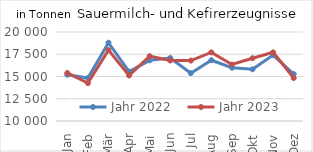
| Category | Jahr 2022 | Jahr 2023 |
|---|---|---|
| Jan | 15200.041 | 15396.886 |
| Feb | 14832.887 | 14256.301 |
| Mär | 18800.027 | 17967.528 |
| Apr | 15550.116 | 15110.787 |
| Mai | 16811.276 | 17283.223 |
| Jun | 17081.681 | 16797.275 |
| Jul | 15375.857 | 16786.662 |
| Aug | 16826.864 | 17707.107 |
| Sep | 15983.62 | 16351.674 |
| Okt | 15808.461 | 17053.779 |
| Nov | 17408.835 | 17716.265 |
| Dez | 15278.514 | 14824.693 |